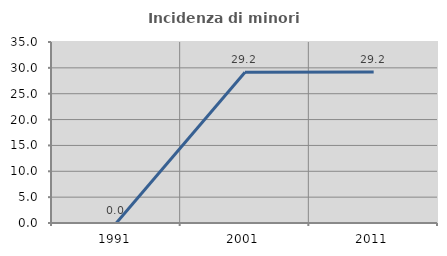
| Category | Incidenza di minori stranieri |
|---|---|
| 1991.0 | 0 |
| 2001.0 | 29.167 |
| 2011.0 | 29.189 |